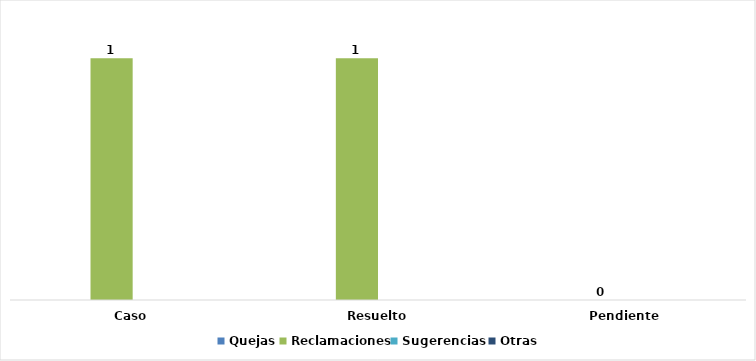
| Category | Quejas | Reclamaciones | Sugerencias  | Otras |
|---|---|---|---|---|
| Caso | 0 | 1 | 0 | 0 |
| Resuelto | 0 | 1 | 0 | 0 |
| Pendiente  | 0 | 0 | 0 | 0 |